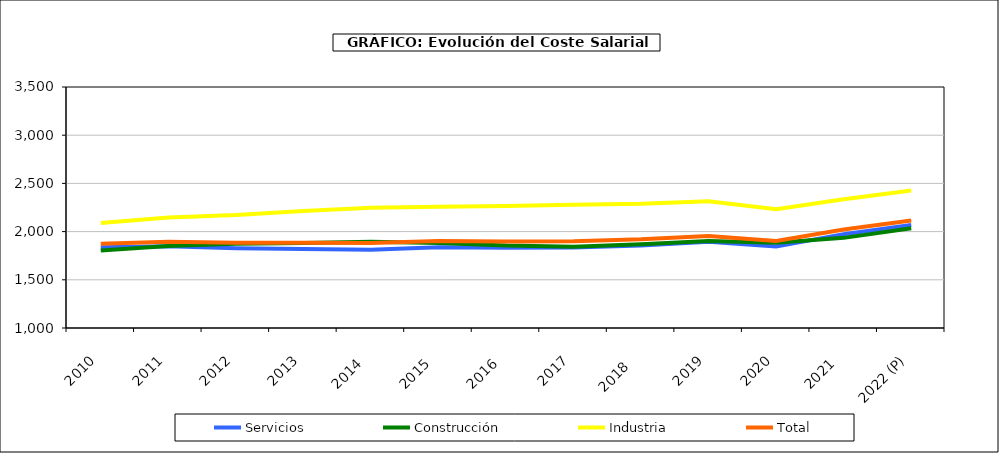
| Category | Servicios | Construcción | Industria | Total |
|---|---|---|---|---|
|  2010 | 1838.732 | 1804.735 | 2088.605 | 1875.23 |
|  2011 | 1848.135 | 1849.53 | 2147.29 | 1894.842 |
|  2012 | 1827.48 | 1872.792 | 2172.148 | 1883.54 |
|  2013 | 1820.002 | 1882.945 | 2214.01 | 1883.76 |
|  2014  | 1811.798 | 1895.448 | 2247.635 | 1881.91 |
|  2015  | 1837.24 | 1882.232 | 2257.03 | 1902.365 |
|  2016  | 1832.052 | 1854.735 | 2266.032 | 1897.502 |
|  2017 | 1834.252 | 1843.038 | 2279.38 | 1900.1 |
|  2018   | 1855.958 | 1869.548 | 2289.278 | 1919.42 |
|  2019 | 1894.81 | 1901.285 | 2315.172 | 1955.188 |
|  2020 | 1846.728 | 1885.358 | 2231.732 | 1903.575 |
|  2021  | 1973.512 | 1935.08 | 2334.685 | 2022.587 |
|  2022 (P) | 2067.475 | 2034.45 | 2426.575 | 2115.135 |